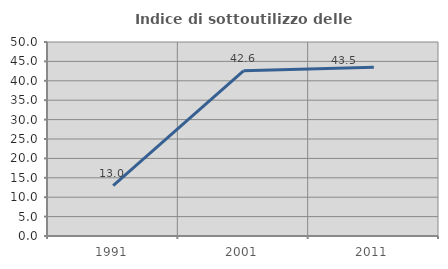
| Category | Indice di sottoutilizzo delle abitazioni  |
|---|---|
| 1991.0 | 13.014 |
| 2001.0 | 42.581 |
| 2011.0 | 43.506 |